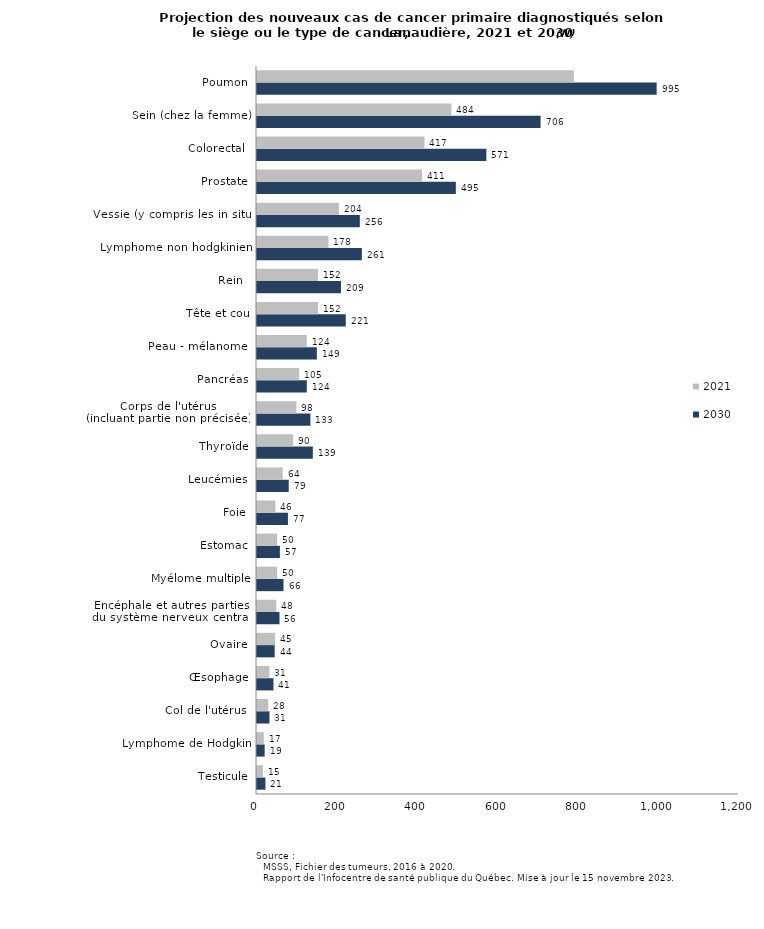
| Category | 2030 | 2021 |
|---|---|---|
| Testicule | 21 | 15 |
| Lymphome de Hodgkin | 19 | 17 |
| Col de l'utérus  | 31 | 28 |
| Œsophage | 41 | 31 |
| Ovaire | 44 | 45 |
| Encéphale et autres parties 
du système nerveux central  | 56 | 48 |
| Myélome multiple | 66 | 50 |
| Estomac | 57 | 50 |
| Foie | 77 | 46 |
| Leucémies | 79 | 64 |
| Thyroïde | 139 | 90 |
| Corps de l'utérus 
(incluant partie non précisée)  | 133 | 98 |
| Pancréas | 124 | 105 |
| Peau - mélanome  | 149 | 124 |
| Tête et cou | 221 | 152 |
| Rein  | 209 | 152 |
| Lymphome non hodgkinien | 261 | 178 |
| Vessie (y compris les in situ) | 256 | 204 |
| Prostate | 495 | 411 |
| Colorectal  | 571 | 417 |
| Sein (chez la femme) | 706 | 484 |
| Poumon | 995 | 789 |